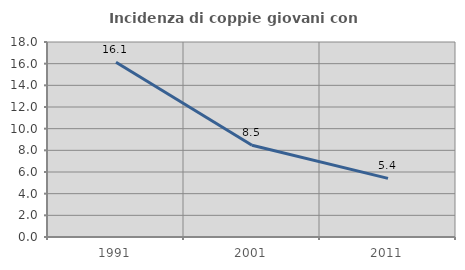
| Category | Incidenza di coppie giovani con figli |
|---|---|
| 1991.0 | 16.133 |
| 2001.0 | 8.464 |
| 2011.0 | 5.409 |